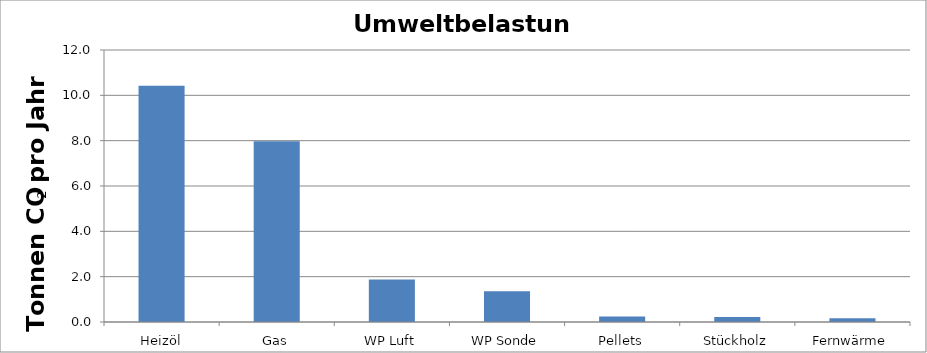
| Category | Fossiles CO2  Tonnen / Jahr |
|---|---|
| Heizöl | 10.42 |
| Gas | 7.976 |
| WP Luft | 1.871 |
| WP Sonde | 1.351 |
| Pellets | 0.241 |
| Stückholz | 0.215 |
| Fernwärme | 0.161 |